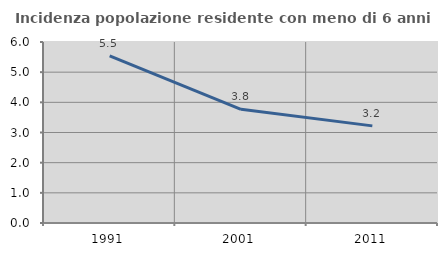
| Category | Incidenza popolazione residente con meno di 6 anni |
|---|---|
| 1991.0 | 5.541 |
| 2001.0 | 3.768 |
| 2011.0 | 3.219 |